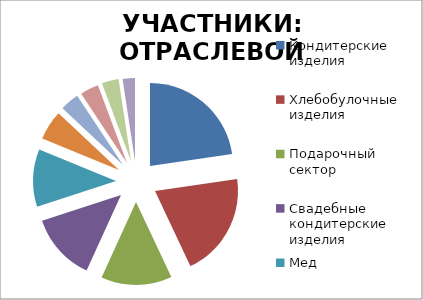
| Category | Exhibitor Countries |
|---|---|
| Кондитерские изделия             | 0.227 |
| Хлебобулочные изделия     | 0.203 |
| Подарочный сектор | 0.138 |
| Свадебные кондитерские изделия | 0.132 |
| Мед       | 0.112 |
| Продукция пчеловодства           | 0.058 |
| Чай, кофе      | 0.037 |
| Безалкогольные напитки | 0.036 |
| Национальные кондитерские и хлебобулчоные изделия    | 0.033 |
| Оборудование  | 0.024 |